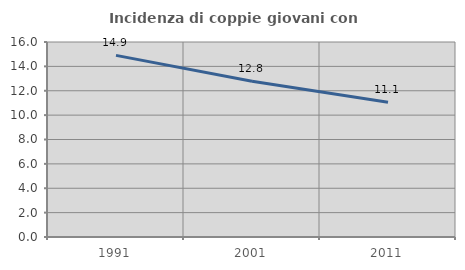
| Category | Incidenza di coppie giovani con figli |
|---|---|
| 1991.0 | 14.904 |
| 2001.0 | 12.781 |
| 2011.0 | 11.053 |